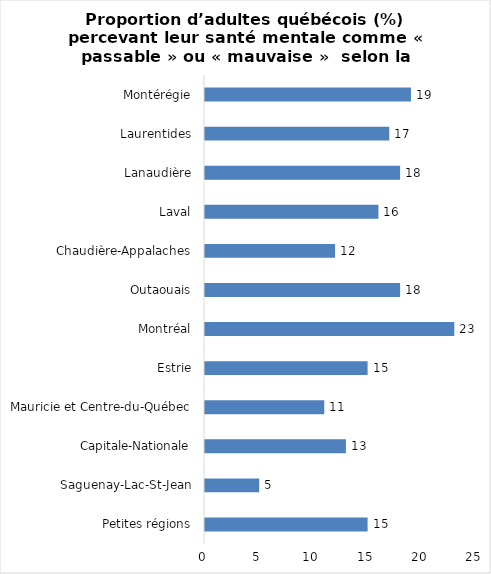
| Category | Series 0 |
|---|---|
| Petites régions | 15 |
| Saguenay-Lac-St-Jean | 5 |
| Capitale-Nationale | 13 |
| Mauricie et Centre-du-Québec | 11 |
| Estrie | 15 |
| Montréal | 23 |
| Outaouais | 18 |
| Chaudière-Appalaches | 12 |
| Laval | 16 |
| Lanaudière | 18 |
| Laurentides | 17 |
| Montérégie | 19 |